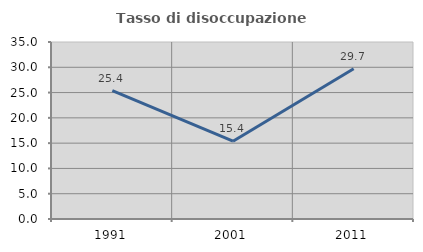
| Category | Tasso di disoccupazione giovanile  |
|---|---|
| 1991.0 | 25.401 |
| 2001.0 | 15.385 |
| 2011.0 | 29.714 |